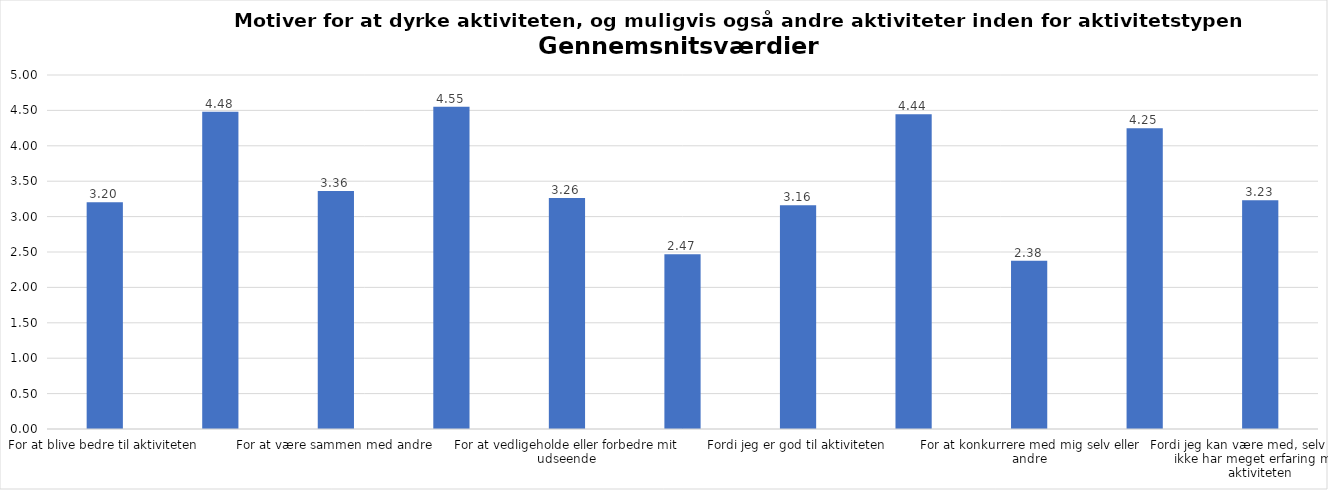
| Category | Gennemsnit |
|---|---|
| For at blive bedre til aktiviteten | 3.204 |
| For at vedligeholde eller forbedre min sundhed (fx helbred, fysisk form) | 4.482 |
| For at være sammen med andre | 3.362 |
| For at gøre noget godt for mig selv | 4.552 |
| For at vedligeholde eller forbedre mit udseende | 3.263 |
| Fordi andre i min omgangskreds opmuntrer mig til det | 2.47 |
| Fordi jeg er god til aktiviteten | 3.159 |
| Fordi jeg godt kan lide aktiviteten | 4.444 |
| For at konkurrere med mig selv eller andre | 2.376 |
| Fordi aktiviteten passer godt ind i min hverdag | 4.246 |
| Fordi jeg kan være med, selv om jeg ikke har meget erfaring med aktiviteten | 3.231 |